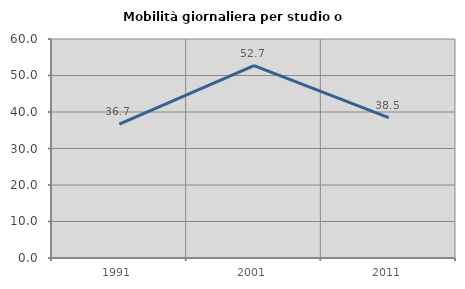
| Category | Mobilità giornaliera per studio o lavoro |
|---|---|
| 1991.0 | 36.667 |
| 2001.0 | 52.679 |
| 2011.0 | 38.462 |